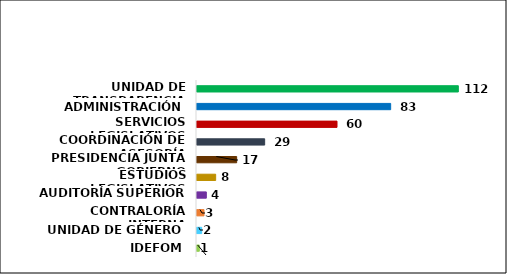
| Category | Series 0 |
|---|---|
| IDEFOM | 1 |
| UNIDAD DE GÉNERO | 2 |
| CONTRALORÍA INTERNA | 3 |
| AUDITORÍA SUPERIOR | 4 |
| ESTUDIOS LEGISLATIVOS | 8 |
| PRESIDENCIA JUNTA GOBIERNO | 17 |
| COORDINACIÓN DE ASESORÍA | 29 |
| SERVICIOS LEGISLATIVOS | 60 |
| ADMINISTRACIÓN | 83 |
| UNIDAD DE TRANSPARENCIA | 112 |